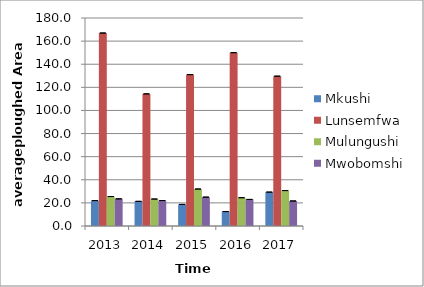
| Category | Mkushi | Lunsemfwa  | Mulungushi | Mwobomshi |
|---|---|---|---|---|
| 2013.0 | 22 | 167 | 25.5 | 23.5 |
| 2014.0 | 21.333 | 114.333 | 23.333 | 22 |
| 2015.0 | 18.667 | 131 | 32 | 25 |
| 2016.0 | 12.5 | 150 | 24.5 | 23 |
| 2017.0 | 29.333 | 129.667 | 30.667 | 21.667 |